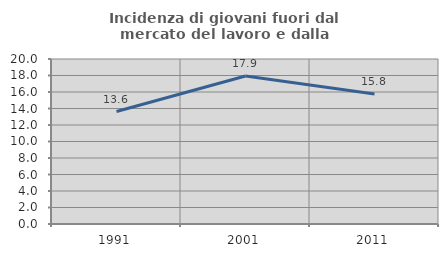
| Category | Incidenza di giovani fuori dal mercato del lavoro e dalla formazione  |
|---|---|
| 1991.0 | 13.631 |
| 2001.0 | 17.931 |
| 2011.0 | 15.76 |